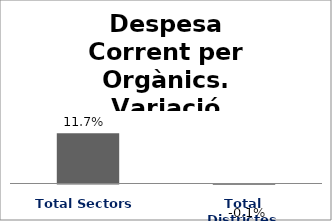
| Category | Series 0 |
|---|---|
| Total Sectors | 0.117 |
| Total Districtes | -0.001 |